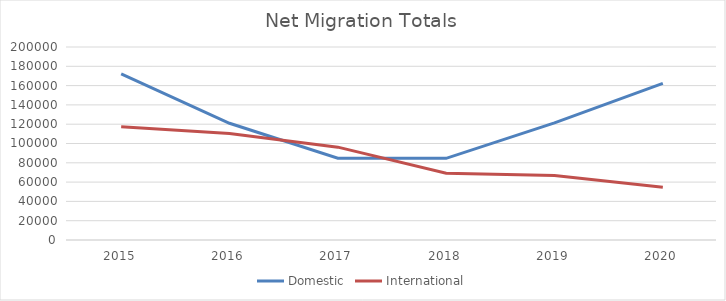
| Category | Domestic | International |
|---|---|---|
| 2015.0 | 172183 | 117265 |
| 2016.0 | 120979 | 110382 |
| 2017.0 | 84806 | 96215 |
| 2018.0 | 84638 | 69138 |
| 2019.0 | 121411 | 66791 |
| 2020.0 | 162299 | 54650 |